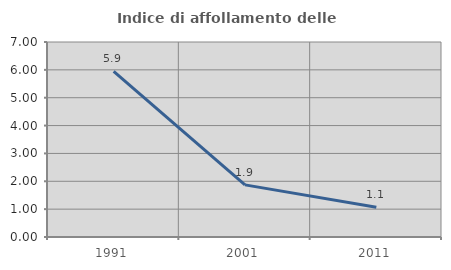
| Category | Indice di affollamento delle abitazioni  |
|---|---|
| 1991.0 | 5.943 |
| 2001.0 | 1.872 |
| 2011.0 | 1.071 |